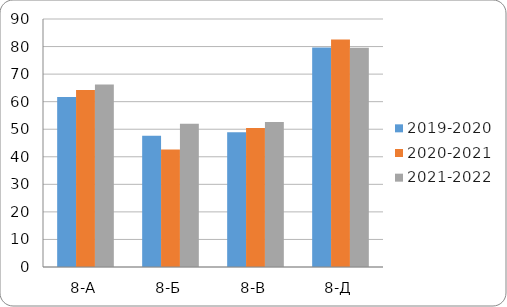
| Category | 2019-2020 | 2020-2021 | 2021-2022 |
|---|---|---|---|
| 8-А | 61.7 | 64.2 | 66.2 |
| 8-Б | 47.6 | 42.6 | 52 |
| 8-В | 48.9 | 50.4 | 52.6 |
| 8-Д | 79.7 | 82.6 | 79.6 |